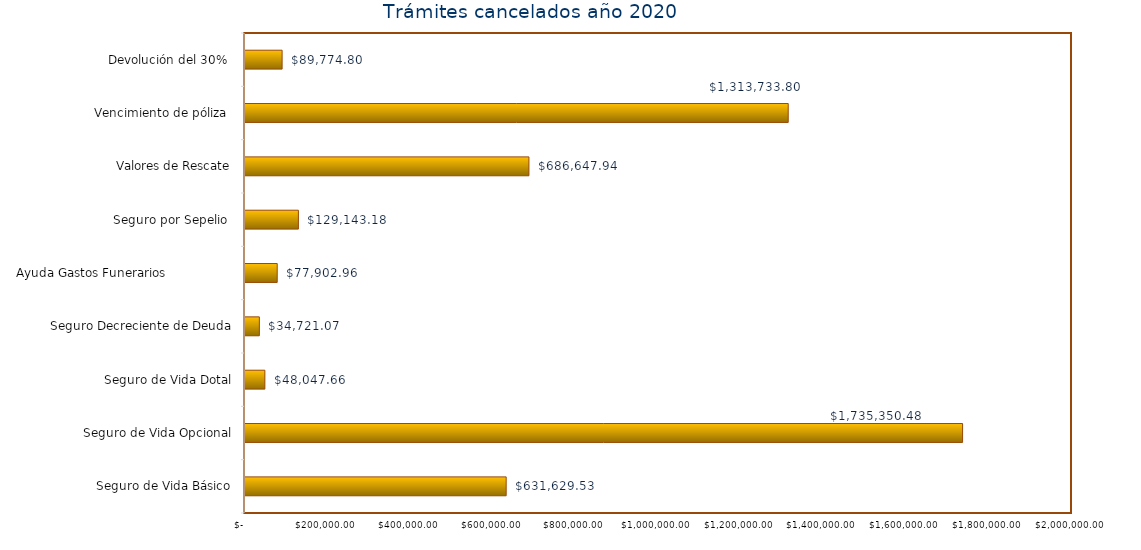
| Category | Monto  |
|---|---|
| Seguro de Vida Básico | 631629.53 |
| Seguro de Vida Opcional | 1735350.48 |
| Seguro de Vida Dotal | 48047.66 |
| Seguro Decreciente de Deuda | 34721.07 |
| Ayuda Gastos Funerarios                  | 77902.96 |
| Seguro por Sepelio  | 129143.18 |
| Valores de Rescate | 686647.94 |
| Vencimiento de póliza  | 1313733.8 |
| Devolución del 30%  | 89774.8 |